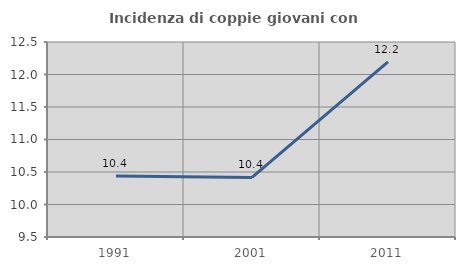
| Category | Incidenza di coppie giovani con figli |
|---|---|
| 1991.0 | 10.44 |
| 2001.0 | 10.417 |
| 2011.0 | 12.195 |